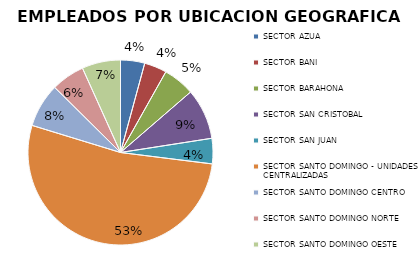
| Category | Series 0 |
|---|---|
| SECTOR AZUA | 117 |
| SECTOR BANI | 109 |
| SECTOR BARAHONA | 153 |
| SECTOR SAN CRISTOBAL | 246 |
| SECTOR SAN JUAN | 123 |
| SECTOR SANTO DOMINGO - UNIDADES CENTRALIZADAS | 1463 |
| SECTOR SANTO DOMINGO CENTRO | 213 |
| SECTOR SANTO DOMINGO NORTE | 162 |
| SECTOR SANTO DOMINGO OESTE | 187 |